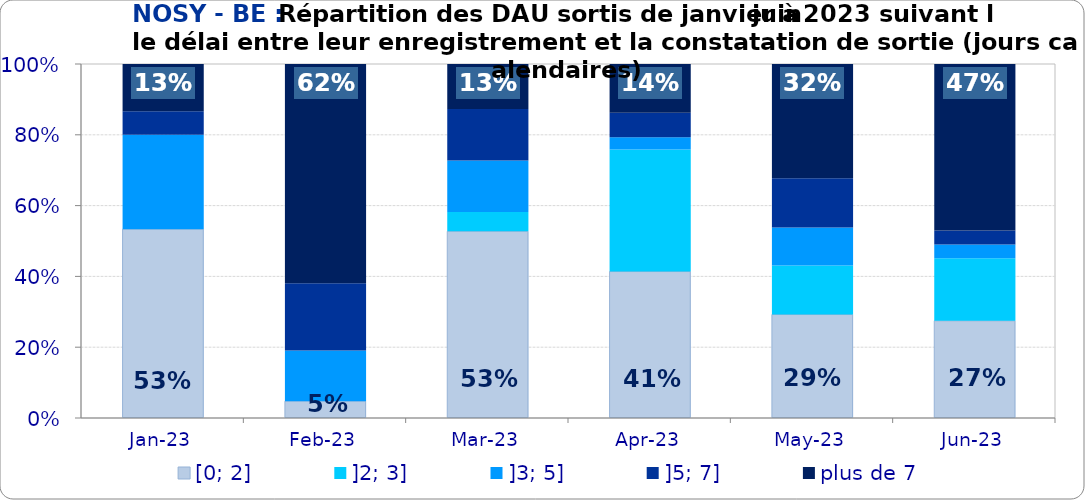
| Category | [0; 2] | ]2; 3] | ]3; 5] | ]5; 7] | plus de 7 |
|---|---|---|---|---|---|
| 2023-01-01 | 0.533 | 0 | 0.267 | 0.067 | 0.133 |
| 2023-02-01 | 0.048 | 0 | 0.143 | 0.19 | 0.619 |
| 2023-03-01 | 0.527 | 0.055 | 0.145 | 0.145 | 0.127 |
| 2023-04-01 | 0.414 | 0.345 | 0.034 | 0.069 | 0.138 |
| 2023-05-01 | 0.292 | 0.138 | 0.108 | 0.138 | 0.323 |
| 2023-06-01 | 0.275 | 0.176 | 0.039 | 0.039 | 0.471 |